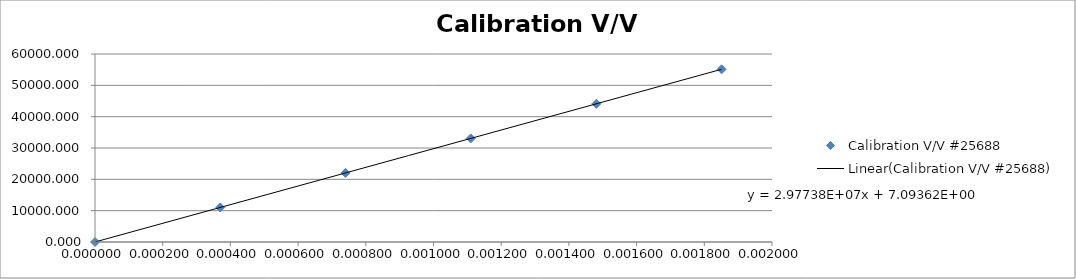
| Category | Calibration V/V #25688 |
|---|---|
| 0.0 | 0 |
| 0.00037 | 11023.113 |
| 0.00074 | 22046.226 |
| 0.00111 | 33069.339 |
| 0.001481 | 44092.452 |
| 0.001851 | 55115.566 |